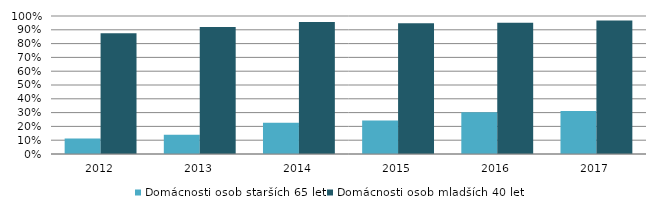
| Category | Domácnosti osob starších 65 let | Domácnosti osob mladších 40 let |
|---|---|---|
| 2012.0 | 0.112 | 0.875 |
| 2013.0 | 0.14 | 0.92 |
| 2014.0 | 0.227 | 0.956 |
| 2015.0 | 0.242 | 0.947 |
| 2016.0 | 0.303 | 0.951 |
| 2017.0 | 0.311 | 0.968 |